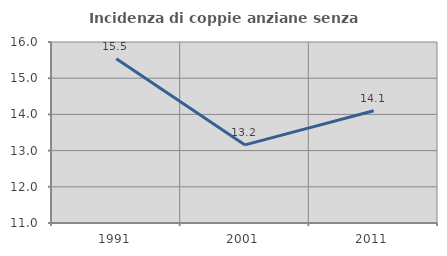
| Category | Incidenza di coppie anziane senza figli  |
|---|---|
| 1991.0 | 15.541 |
| 2001.0 | 13.158 |
| 2011.0 | 14.103 |